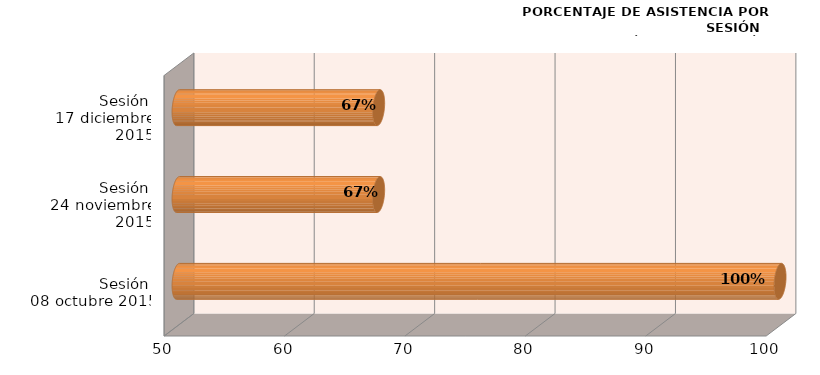
| Category | Series 0 |
|---|---|
| Sesión 
08 octubre 2015 | 100 |
| Sesión 
24 noviembre 2015 | 66.667 |
| Sesión 
17 diciembre 2015 | 66.667 |